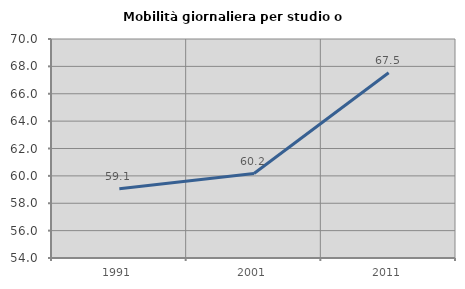
| Category | Mobilità giornaliera per studio o lavoro |
|---|---|
| 1991.0 | 59.058 |
| 2001.0 | 60.171 |
| 2011.0 | 67.534 |